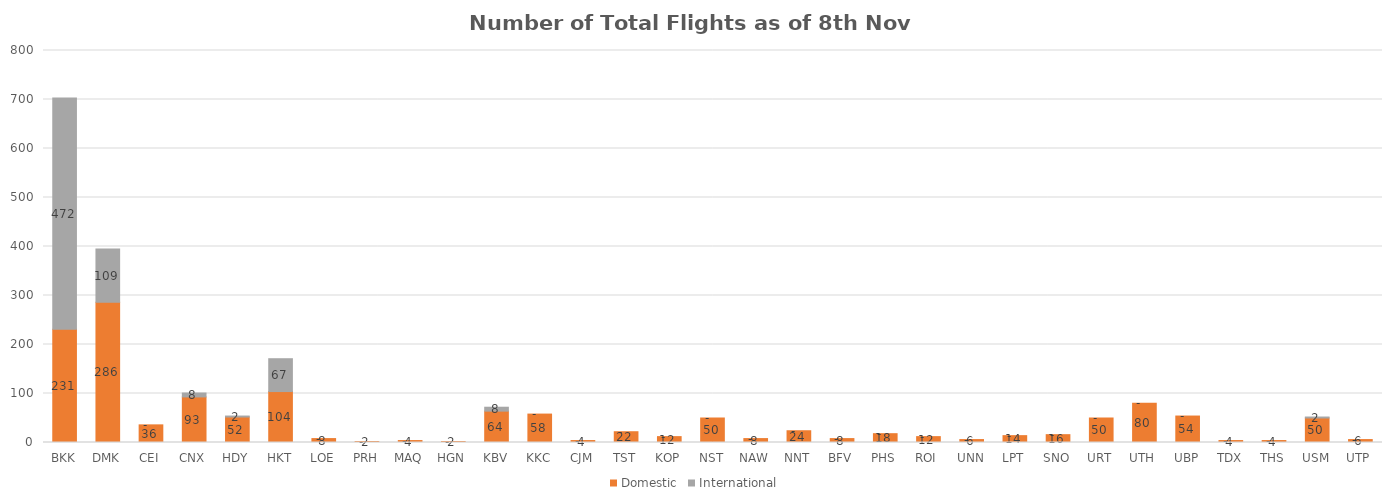
| Category | Domestic | International |
|---|---|---|
| BKK | 231 | 472 |
| DMK | 286 | 109 |
| CEI | 36 | 0 |
| CNX | 93 | 8 |
| HDY | 52 | 2 |
| HKT | 104 | 67 |
| LOE | 8 | 0 |
| PRH | 2 | 0 |
| MAQ | 4 | 0 |
| HGN | 2 | 0 |
| KBV | 64 | 8 |
| KKC | 58 | 0 |
| CJM | 4 | 0 |
| TST | 22 | 0 |
| KOP | 12 | 0 |
| NST | 50 | 0 |
| NAW | 8 | 0 |
| NNT | 24 | 0 |
| BFV | 8 | 0 |
| PHS | 18 | 0 |
| ROI | 12 | 0 |
| UNN | 6 | 0 |
| LPT | 14 | 0 |
| SNO | 16 | 0 |
| URT | 50 | 0 |
| UTH | 80 | 0 |
| UBP | 54 | 0 |
| TDX | 4 | 0 |
| THS | 4 | 0 |
| USM | 50 | 2 |
| UTP | 6 | 0 |